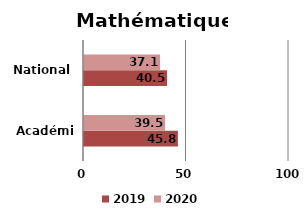
| Category | 2019 | 2020 |
|---|---|---|
| Académie | 45.8 | 39.5 |
| National | 40.5 | 37.1 |